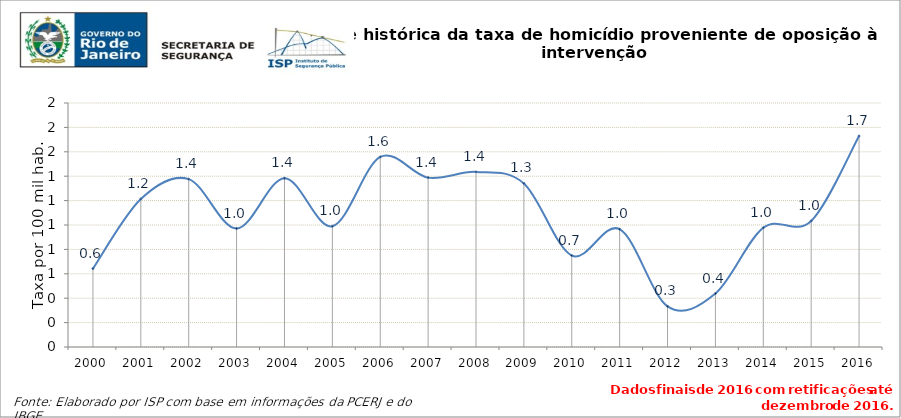
| Category | Series 0 |
|---|---|
| 2000.0 | 0.642 |
| 2001.0 | 1.213 |
| 2002.0 | 1.376 |
| 2003.0 | 0.971 |
| 2004.0 | 1.383 |
| 2005.0 | 0.99 |
| 2006.0 | 1.558 |
| 2007.0 | 1.388 |
| 2008.0 | 1.435 |
| 2009.0 | 1.341 |
| 2010.0 | 0.749 |
| 2011.0 | 0.965 |
| 2012.0 | 0.333 |
| 2013.0 | 0.438 |
| 2014.0 | 0.977 |
| 2015.0 | 1.033 |
| 2016.0 | 1.729 |